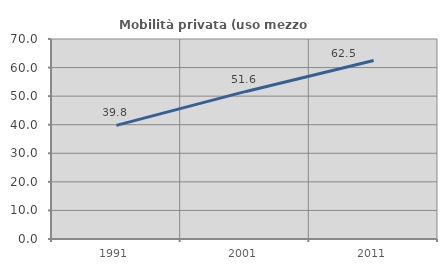
| Category | Mobilità privata (uso mezzo privato) |
|---|---|
| 1991.0 | 39.775 |
| 2001.0 | 51.564 |
| 2011.0 | 62.48 |